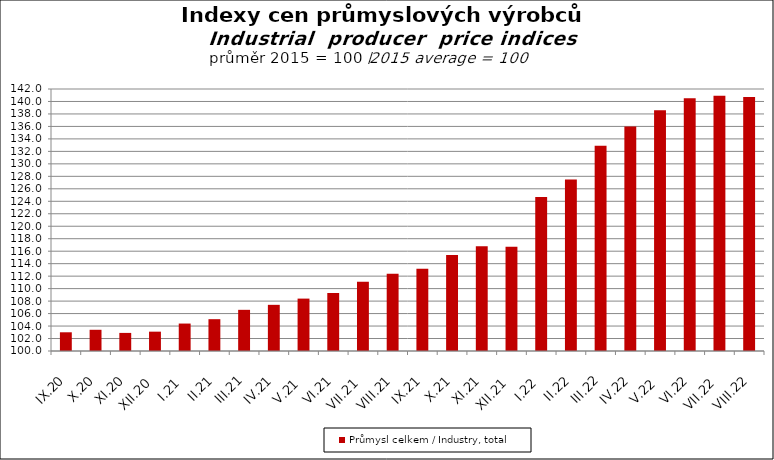
| Category | Průmysl celkem / Industry, total |
|---|---|
| IX.20 | 103 |
| X.20 | 103.4 |
| XI.20 | 102.9 |
| XII.20 | 103.1 |
| I.21 | 104.4 |
| II.21 | 105.1 |
| III.21 | 106.6 |
| IV.21 | 107.4 |
| V.21 | 108.4 |
| VI.21 | 109.3 |
| VII.21 | 111.1 |
| VIII.21 | 112.4 |
| IX.21 | 113.2 |
| X.21 | 115.4 |
| XI.21 | 116.8 |
| XII.21 | 116.7 |
| I.22 | 124.7 |
| II.22 | 127.5 |
| III.22 | 132.9 |
| IV.22 | 136 |
| V.22 | 138.6 |
| VI.22 | 140.5 |
| VII.22 | 140.9 |
| VIII.22 | 140.7 |